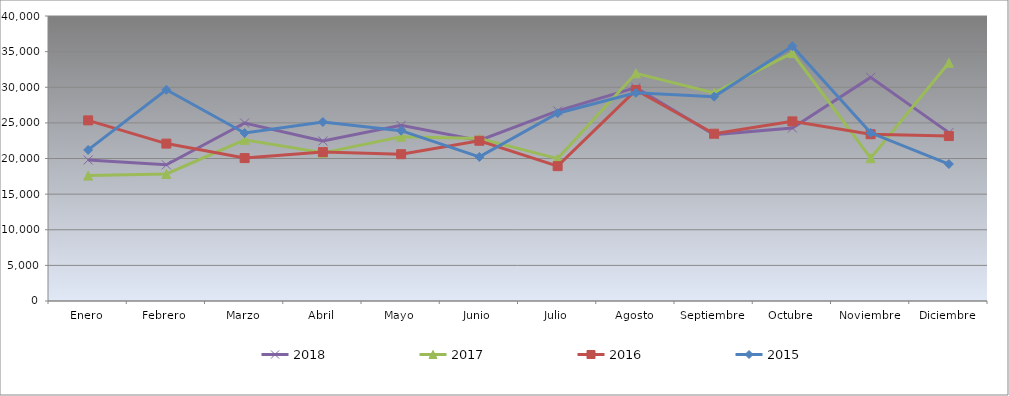
| Category | 2018 | 2017 | 2016 | 2015 |
|---|---|---|---|---|
| Enero | 19792.816 | 17597.359 | 25352.169 | 21206.738 |
| Febrero | 19110.904 | 17830.963 | 22091.801 | 29647.381 |
| Marzo | 24982.789 | 22613.637 | 20057.904 | 23577.474 |
| Abril | 22460.953 | 20793.264 | 20898.548 | 25125.814 |
| Mayo | 24645.552 | 23052.266 | 20603.428 | 23904.117 |
| Junio | 22545.262 | 22818.662 | 22492.96 | 20223.593 |
| Julio | 26686.33 | 19988.074 | 18925.974 | 26357.8 |
| Agosto | 29957.029 | 31956.565 | 29606.489 | 29215.286 |
| Septiembre | 23353.638 | 29210.472 | 23479.246 | 28682.883 |
| Octubre | 24277.32 | 34807.033 | 25210.358 | 35768.728 |
| Noviembre | 31382.846 | 20052.688 | 23410.257 | 23600.622 |
| Diciembre | 23631.363 | 33432.745 | 23147.077 | 19217.943 |